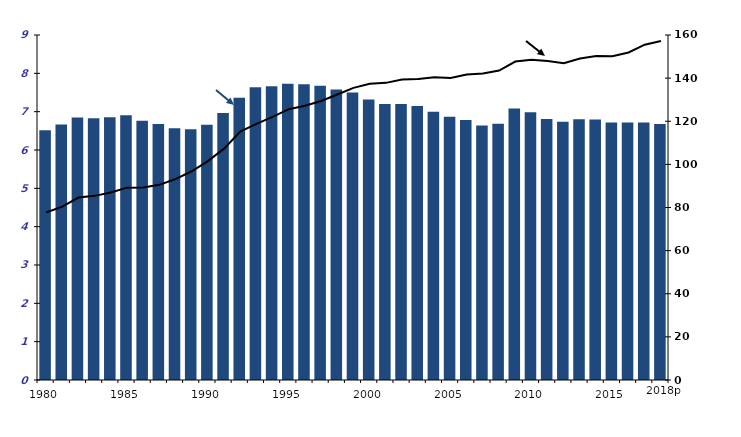
| Category | Series 1 |
|---|---|
| 1980 | 6.518 |
| 1981 | 6.668 |
| 1982 | 6.847 |
| 1983 | 6.827 |
| 1984 | 6.854 |
| 1985 | 6.909 |
| 1986 | 6.763 |
| 1987 | 6.678 |
| 1988 | 6.567 |
| 1989 | 6.54 |
| 1990 | 6.661 |
| 1991 | 6.966 |
| 1992 | 7.363 |
| 1993 | 7.639 |
| 1994 | 7.665 |
| 1995 | 7.728 |
| 1996 | 7.718 |
| 1997 | 7.675 |
| 1998 | 7.578 |
| 1999 | 7.503 |
| 2000 | 7.318 |
| 2001 | 7.198 |
| 2002 | 7.2 |
| 2003 | 7.149 |
| 2004 | 6.996 |
| 2005 | 6.865 |
| 2006 | 6.779 |
| 2007 | 6.642 |
| 2008 | 6.685 |
| 2009 | 7.081 |
| 2010 | 6.983 |
| 2011 | 6.806 |
| 2012 | 6.74 |
| 2013 | 6.801 |
| 2014 | 6.794 |
| 2015 | 6.715 |
| 2016 | 6.717 |
| 2017 | 6.721 |
| 2018p | 6.681 |